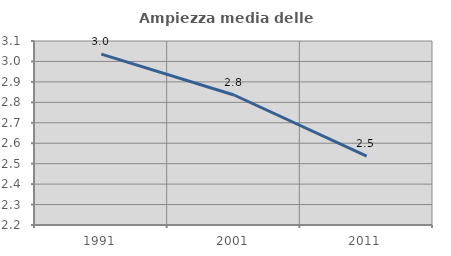
| Category | Ampiezza media delle famiglie |
|---|---|
| 1991.0 | 3.036 |
| 2001.0 | 2.836 |
| 2011.0 | 2.537 |